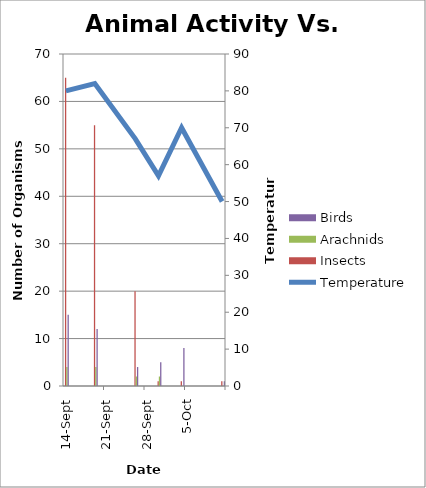
| Category | Insects | Arachnids | Birds |
|---|---|---|---|
| 2006-09-14 | 65 | 4 | 15 |
| 2006-09-19 | 55 | 4 | 12 |
| 2006-09-26 | 20 | 2 | 4 |
| 2006-09-30 | 1 | 2 | 5 |
| 2006-10-04 | 1 | 0 | 8 |
| 2006-10-11 | 1 | 0 | 1 |